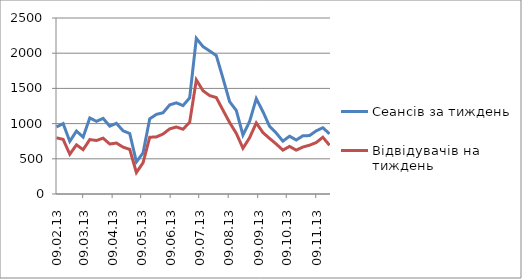
| Category | Сеансів за тиждень | Відвідувачів на тиждень |
|---|---|---|
| 2013-02-09 | 952 | 798 |
| 2013-02-16 | 1000 | 776 |
| 2013-02-23 | 748 | 565 |
| 2013-03-02 | 894 | 698 |
| 2013-03-09 | 809 | 630 |
| 2013-03-16 | 1080 | 773 |
| 2013-03-23 | 1032 | 760 |
| 2013-03-30 | 1074 | 793 |
| 2013-04-06 | 964 | 710 |
| 2013-04-13 | 1004 | 724 |
| 2013-04-20 | 898 | 665 |
| 2013-04-27 | 859 | 634 |
| 2013-05-04 | 456 | 304 |
| 2013-05-11 | 584 | 444 |
| 2013-05-18 | 1068 | 806 |
| 2013-05-25 | 1131 | 811 |
| 2013-06-01 | 1154 | 852 |
| 2013-06-08 | 1266 | 925 |
| 2013-06-15 | 1295 | 952 |
| 2013-06-22 | 1256 | 920 |
| 2013-06-29 | 1366 | 1019 |
| 2013-07-06 | 2211 | 1621 |
| 2013-07-13 | 2094 | 1467 |
| 2013-07-20 | 2032 | 1398 |
| 2013-07-27 | 1966 | 1370 |
| 2013-08-03 | 1644 | 1191 |
| 2013-08-10 | 1311 | 1015 |
| 2013-08-17 | 1187 | 862 |
| 2013-08-24 | 837 | 650 |
| 2013-08-31 | 1030 | 799 |
| 2013-09-07 | 1354 | 1010 |
| 2013-09-14 | 1170 | 872 |
| 2013-09-21 | 960 | 789 |
| 2013-09-28 | 865 | 710 |
| 2013-10-05 | 751 | 623 |
| 2013-10-12 | 821 | 676 |
| 2013-10-19 | 767 | 623 |
| 2013-10-26 | 827 | 667 |
| 2013-11-02 | 830 | 693 |
| 2013-11-09 | 897 | 731 |
| 2013-11-16 | 941 | 806 |
| 2013-11-23 | 854 | 692 |